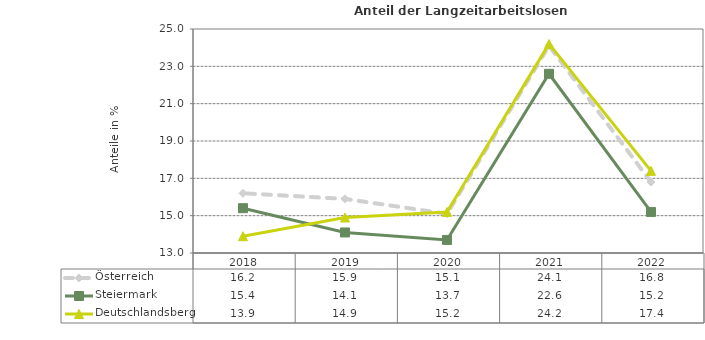
| Category | Österreich | Steiermark | Deutschlandsberg |
|---|---|---|---|
| 2022.0 | 16.8 | 15.2 | 17.4 |
| 2021.0 | 24.1 | 22.6 | 24.2 |
| 2020.0 | 15.1 | 13.7 | 15.2 |
| 2019.0 | 15.9 | 14.1 | 14.9 |
| 2018.0 | 16.2 | 15.4 | 13.9 |